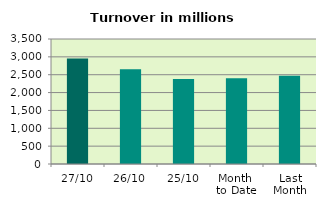
| Category | Series 0 |
|---|---|
| 27/10 | 2954.354 |
| 26/10 | 2652.844 |
| 25/10 | 2377.677 |
| Month 
to Date | 2399.38 |
| Last
Month | 2468.023 |